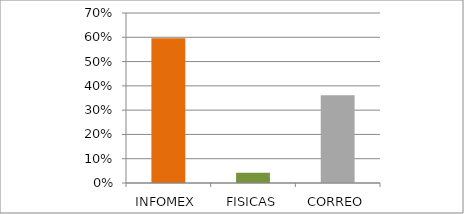
| Category | Series 0 |
|---|---|
| INFOMEX | 0.596 |
| FISICAS | 0.043 |
| CORREO | 0.362 |